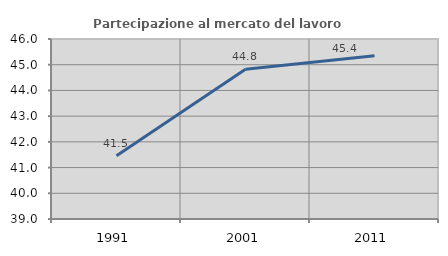
| Category | Partecipazione al mercato del lavoro  femminile |
|---|---|
| 1991.0 | 41.461 |
| 2001.0 | 44.828 |
| 2011.0 | 45.352 |